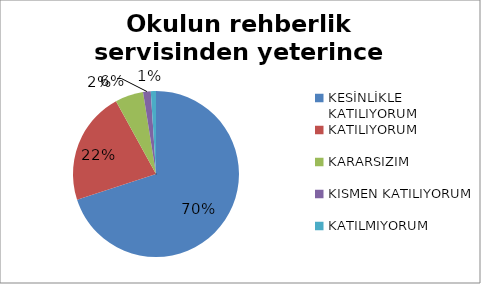
| Category | Okulun rehberlik servisinden yeterince yararlanabiliyorum. |
|---|---|
| KESİNLİKLE KATILIYORUM | 140 |
| KATILIYORUM | 44 |
| KARARSIZIM | 11 |
| KISMEN KATILIYORUM | 3 |
| KATILMIYORUM | 2 |